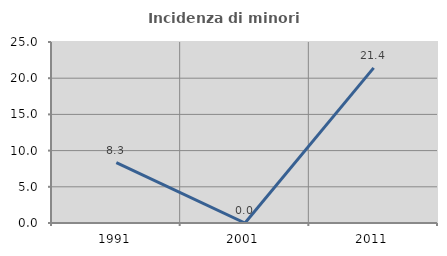
| Category | Incidenza di minori stranieri |
|---|---|
| 1991.0 | 8.333 |
| 2001.0 | 0 |
| 2011.0 | 21.429 |